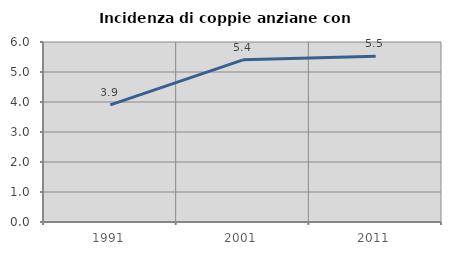
| Category | Incidenza di coppie anziane con figli |
|---|---|
| 1991.0 | 3.904 |
| 2001.0 | 5.405 |
| 2011.0 | 5.521 |